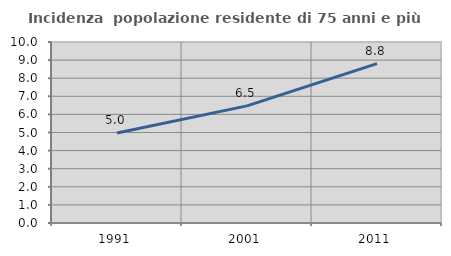
| Category | Incidenza  popolazione residente di 75 anni e più |
|---|---|
| 1991.0 | 4.969 |
| 2001.0 | 6.47 |
| 2011.0 | 8.802 |